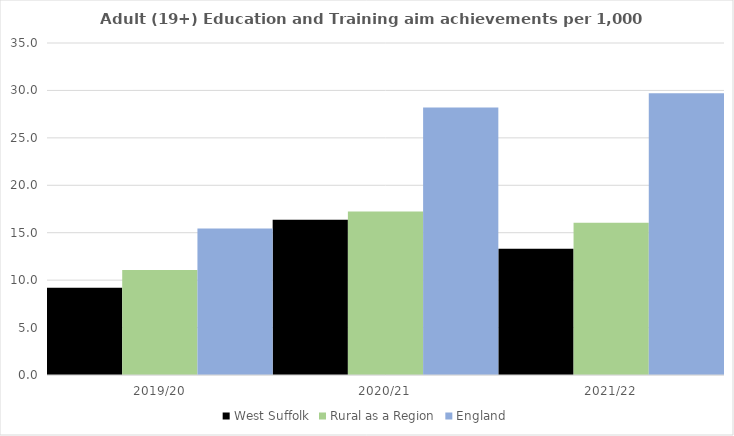
| Category | West Suffolk | Rural as a Region | England |
|---|---|---|---|
| 2019/20 | 9.207 | 11.081 | 15.446 |
| 2020/21 | 16.365 | 17.224 | 28.211 |
| 2021/22 | 13.306 | 16.063 | 29.711 |